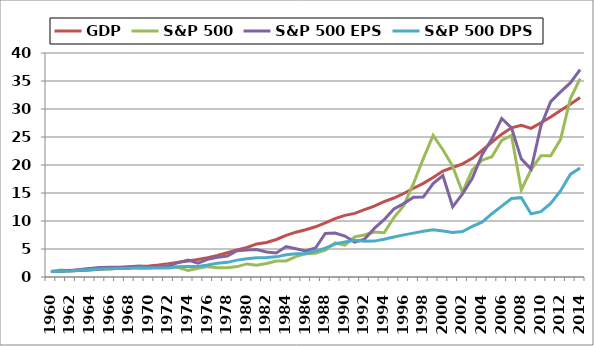
| Category | GDP | S&P 500 | S&P 500 EPS | S&P 500 DPS |
|---|---|---|---|---|
| 1960.0 | 1 | 1 | 1 | 1 |
| 1961.0 | 1.037 | 1.231 | 1.087 | 1.03 |
| 1962.0 | 1.114 | 1.086 | 1.184 | 1.086 |
| 1963.0 | 1.175 | 1.291 | 1.332 | 1.187 |
| 1964.0 | 1.262 | 1.458 | 1.535 | 1.303 |
| 1965.0 | 1.369 | 1.591 | 1.71 | 1.429 |
| 1966.0 | 1.5 | 1.382 | 1.745 | 1.455 |
| 1967.0 | 1.586 | 1.66 | 1.761 | 1.505 |
| 1968.0 | 1.735 | 1.787 | 1.845 | 1.535 |
| 1969.0 | 1.877 | 1.584 | 1.968 | 1.636 |
| 1970.0 | 1.98 | 1.586 | 1.777 | 1.611 |
| 1971.0 | 2.149 | 1.757 | 1.797 | 1.596 |
| 1972.0 | 2.36 | 2.031 | 1.99 | 1.611 |
| 1973.0 | 2.629 | 1.679 | 2.568 | 1.823 |
| 1974.0 | 2.851 | 1.18 | 3.016 | 1.879 |
| 1975.0 | 3.109 | 1.552 | 2.487 | 1.884 |
| 1976.0 | 3.456 | 1.849 | 3.145 | 2.131 |
| 1977.0 | 3.839 | 1.637 | 3.506 | 2.455 |
| 1978.0 | 4.338 | 1.654 | 3.755 | 2.616 |
| 1979.0 | 4.845 | 1.858 | 4.694 | 3.015 |
| 1980.0 | 5.269 | 2.336 | 4.835 | 3.253 |
| 1981.0 | 5.91 | 2.109 | 4.897 | 3.449 |
| 1982.0 | 6.157 | 2.42 | 4.458 | 3.5 |
| 1983.0 | 6.696 | 2.838 | 4.287 | 3.596 |
| 1984.0 | 7.437 | 2.878 | 5.432 | 3.955 |
| 1985.0 | 8.001 | 3.636 | 5.058 | 4.141 |
| 1986.0 | 8.449 | 4.167 | 4.655 | 4.136 |
| 1987.0 | 8.964 | 4.252 | 5.174 | 4.631 |
| 1988.0 | 9.668 | 4.779 | 7.781 | 5.162 |
| 1989.0 | 10.414 | 6.082 | 7.845 | 5.924 |
| 1990.0 | 11.006 | 5.683 | 7.306 | 6.237 |
| 1991.0 | 11.364 | 7.178 | 6.226 | 6.551 |
| 1992.0 | 12.036 | 7.498 | 6.732 | 6.384 |
| 1993.0 | 12.661 | 8.027 | 8.677 | 6.409 |
| 1994.0 | 13.453 | 7.903 | 10.242 | 6.747 |
| 1995.0 | 14.107 | 10.599 | 12.161 | 7.157 |
| 1996.0 | 14.909 | 12.747 | 13.106 | 7.52 |
| 1997.0 | 15.845 | 16.7 | 14.223 | 7.838 |
| 1998.0 | 16.73 | 21.154 | 14.281 | 8.182 |
| 1999.0 | 17.781 | 25.284 | 16.671 | 8.439 |
| 2000.0 | 18.93 | 22.72 | 18.106 | 8.217 |
| 2001.0 | 19.551 | 19.757 | 12.532 | 7.949 |
| 2002.0 | 20.205 | 15.141 | 14.852 | 8.121 |
| 2003.0 | 21.187 | 19.135 | 17.642 | 9.03 |
| 2004.0 | 22.593 | 20.856 | 21.832 | 9.802 |
| 2005.0 | 24.1 | 21.482 | 24.661 | 11.303 |
| 2006.0 | 25.503 | 24.407 | 28.297 | 12.652 |
| 2007.0 | 26.648 | 25.269 | 26.626 | 14.005 |
| 2008.0 | 27.091 | 15.544 | 21.094 | 14.167 |
| 2009.0 | 26.539 | 19.189 | 19.242 | 11.268 |
| 2010.0 | 27.544 | 21.642 | 26.987 | 11.677 |
| 2011.0 | 28.562 | 21.642 | 31.306 | 13.141 |
| 2012.0 | 29.75 | 24.543 | 33.055 | 15.374 |
| 2013.0 | 30.863 | 31.808 | 34.661 | 18.323 |
| 2014.0 | 32.065 | 35.431 | 37.013 | 19.48 |